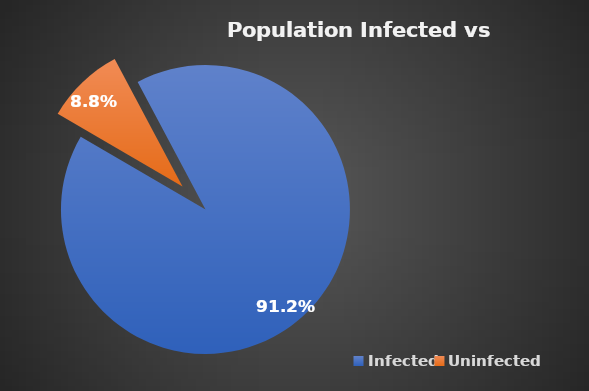
| Category | Series 0 |
|---|---|
| 0 | 0.912 |
| 1 | 0.088 |